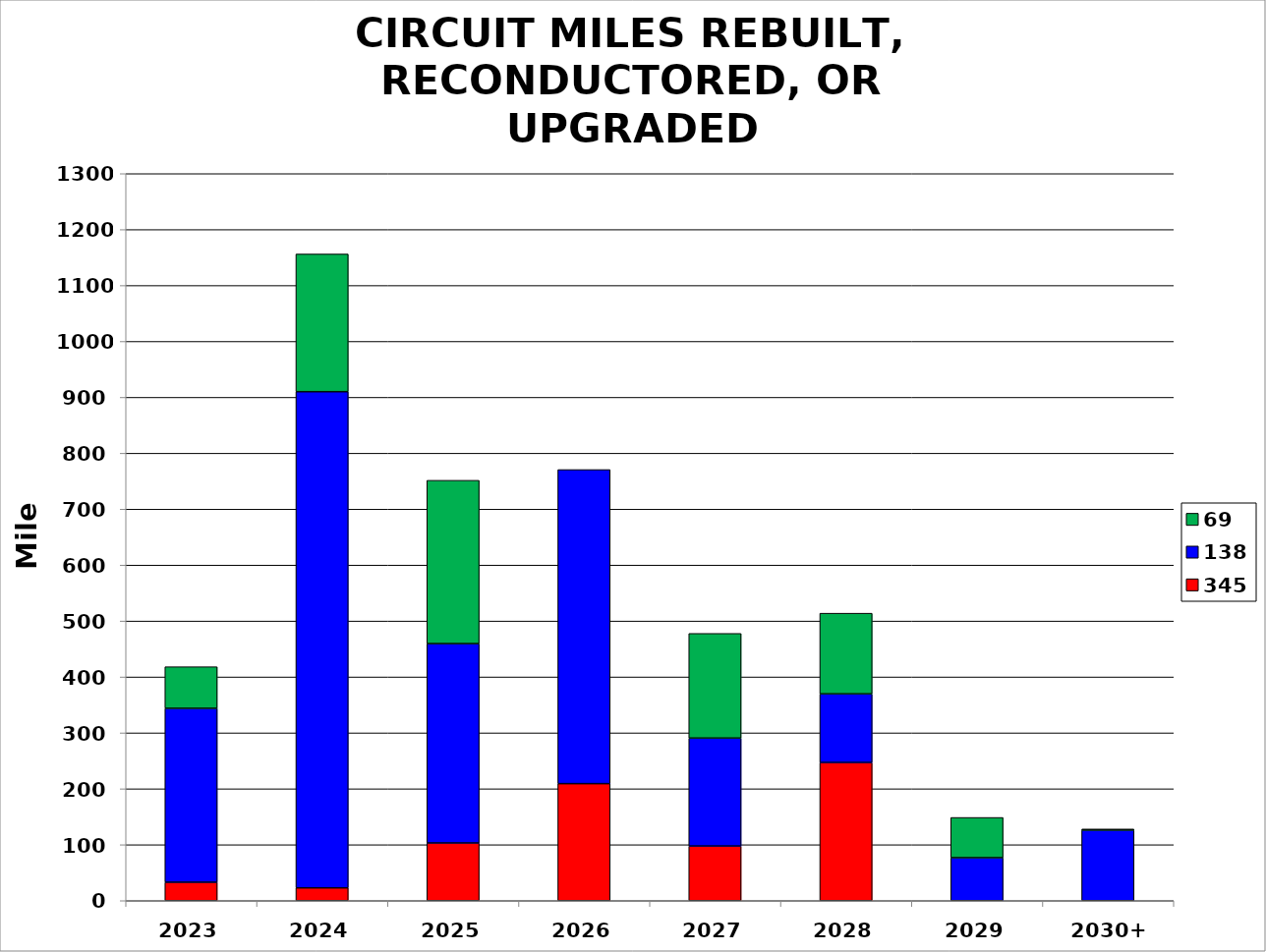
| Category | 345 | 138 | 69 |
|---|---|---|---|
| 2023 | 32.92 | 311.031 | 74.36 |
| 2024 | 22.9 | 887.22 | 246.19 |
| 2025 | 103.17 | 356.48 | 292.01 |
| 2026 | 209.27 | 561.6 | 0 |
| 2027 | 97.7 | 193.06 | 187.091 |
| 2028 | 247 | 122.848 | 144.18 |
| 2029 | 0 | 76.87 | 71.92 |
| 2030+ | 0 | 126.18 | 2 |